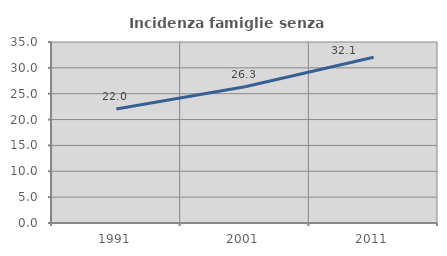
| Category | Incidenza famiglie senza nuclei |
|---|---|
| 1991.0 | 22.035 |
| 2001.0 | 26.33 |
| 2011.0 | 32.068 |